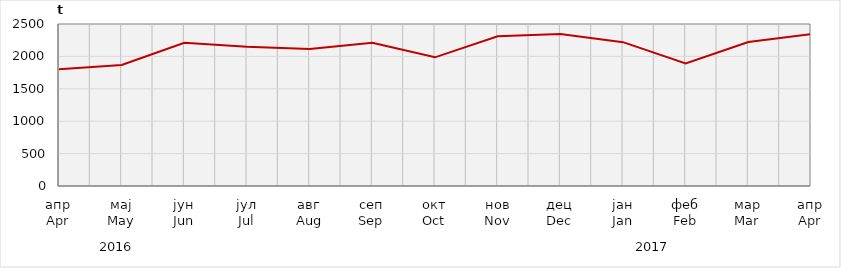
| Category | Нето тежина заклане стоке                              Net weight of  slaughtered livestock |
|---|---|
| апр
Apr | 1800600 |
| мај
May | 1866665 |
| јун
Jun | 2210576.92 |
| јул
Jul | 2148617 |
| авг
Aug | 2114109.78 |
| сеп
Sep | 2211725.58 |
| окт
Oct | 1985741.43 |
| нов
Nov | 2309850.52 |
| дец
Dec | 2344927.28 |
| јан
Jan | 2220030.9 |
| феб
Feb | 1890056.65 |
| мар
Mar | 2221281.4 |
| апр
Apr | 2344899.97 |